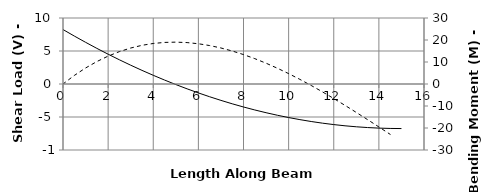
| Category | V |
|---|---|
| 0.0 | 8.25 |
| 0.0 | 8.25 |
| 0.0 | 8.25 |
| 0.5 | 7.267 |
| 1.0 | 6.317 |
| 1.5 | 5.4 |
| 1.99999 | 4.517 |
| 2.0 | 4.517 |
| 2.00001 | 4.517 |
| 2.5 | 3.667 |
| 3.0 | 2.85 |
| 3.5 | 2.067 |
| 4.0 | 1.317 |
| 4.5 | 0.6 |
| 5.0 | -0.083 |
| 5.5 | -0.733 |
| 6.0 | -1.35 |
| 6.5 | -1.933 |
| 7.0 | -2.483 |
| 7.5 | -3 |
| 8.0 | -3.483 |
| 8.5 | -3.933 |
| 9.0 | -4.35 |
| 9.5 | -4.733 |
| 10.0 | -5.083 |
| 10.5 | -5.4 |
| 11.0 | -5.683 |
| 11.5 | -5.933 |
| 12.0 | -6.15 |
| 12.5 | -6.333 |
| 13.0 | -6.483 |
| 13.5 | -6.6 |
| 14.0 | -6.683 |
| 14.5 | -6.733 |
| 15.0 | -6.75 |